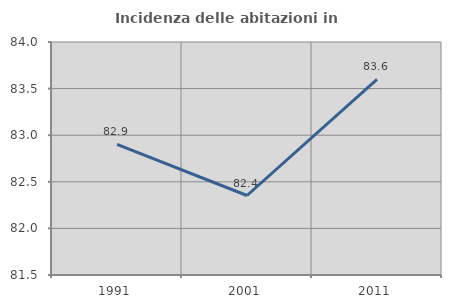
| Category | Incidenza delle abitazioni in proprietà  |
|---|---|
| 1991.0 | 82.902 |
| 2001.0 | 82.353 |
| 2011.0 | 83.6 |